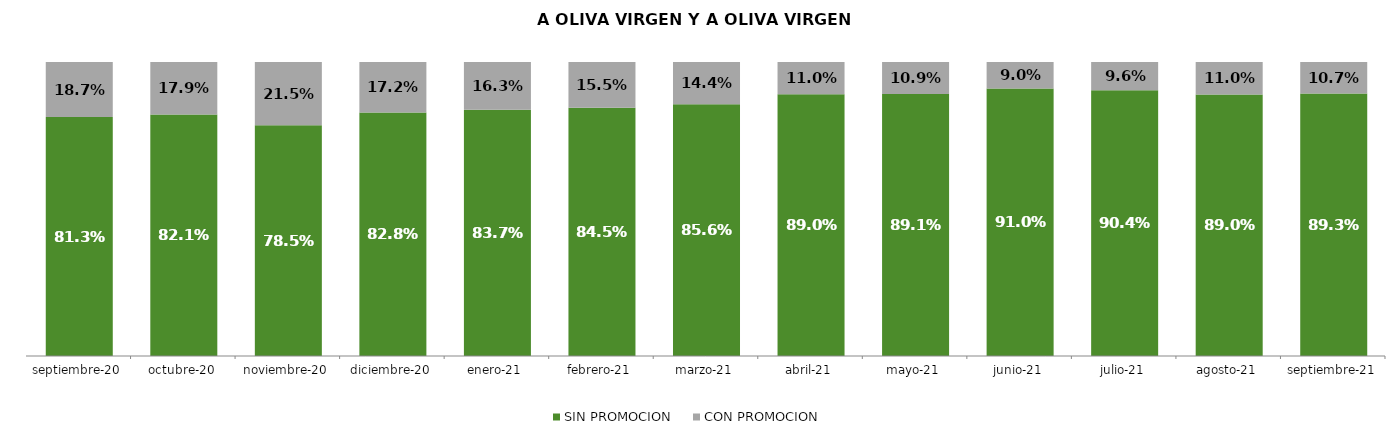
| Category | SIN PROMOCION   | CON PROMOCION   |
|---|---|---|
| 2020-09-01 | 0.813 | 0.187 |
| 2020-10-01 | 0.821 | 0.179 |
| 2020-11-01 | 0.785 | 0.215 |
| 2020-12-01 | 0.828 | 0.172 |
| 2021-01-01 | 0.837 | 0.163 |
| 2021-02-01 | 0.845 | 0.155 |
| 2021-03-01 | 0.856 | 0.144 |
| 2021-04-01 | 0.89 | 0.11 |
| 2021-05-01 | 0.891 | 0.109 |
| 2021-06-01 | 0.91 | 0.09 |
| 2021-07-01 | 0.904 | 0.096 |
| 2021-08-01 | 0.89 | 0.11 |
| 2021-09-01 | 0.893 | 0.107 |